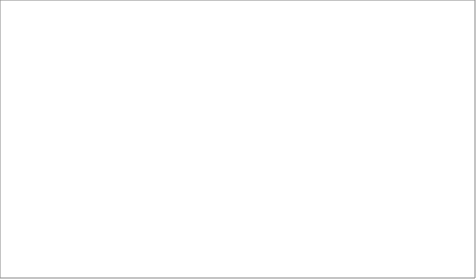
| Category | 2008 | 2009 | 2010 | 2011 | 2012 | 2013 |
|---|---|---|---|---|---|---|
| Afganistan | 1 | 5 | 3 | 2 | 2 | 3 |